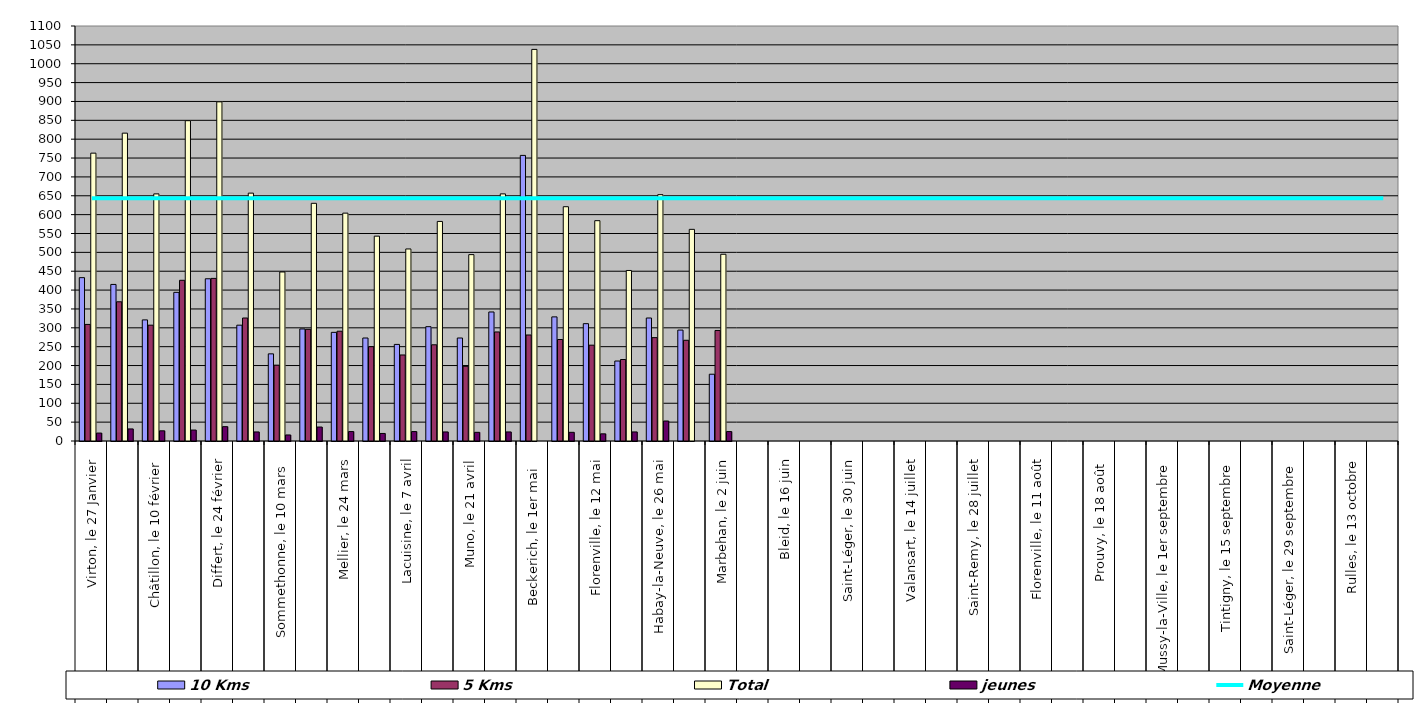
| Category | 10 Kms | 5 Kms | Total | jeunes |
|---|---|---|---|---|
| 0 | 433 | 309 | 763 | 21 |
| 1 | 415 | 369 | 816 | 32 |
| 2 | 321 | 307 | 655 | 27 |
| 3 | 394 | 426 | 849 | 29 |
| 4 | 430 | 431 | 899 | 38 |
| 5 | 307 | 326 | 657 | 24 |
| 6 | 231 | 201 | 448 | 16 |
| 7 | 297 | 296 | 630 | 37 |
| 8 | 288 | 291 | 604 | 25 |
| 9 | 273 | 250 | 543 | 20 |
| 10 | 256 | 228 | 509 | 25 |
| 11 | 303 | 255 | 582 | 24 |
| 12 | 273 | 198 | 494 | 23 |
| 13 | 342 | 289 | 655 | 24 |
| 14 | 757 | 281 | 1038 | 0 |
| 15 | 329 | 269 | 621 | 23 |
| 16 | 311 | 254 | 584 | 19 |
| 17 | 212 | 216 | 452 | 24 |
| 18 | 326 | 274 | 653 | 53 |
| 19 | 294 | 267 | 561 | 0 |
| 20 | 177 | 293 | 495 | 25 |
| 21 | 0 | 0 | 0 | 0 |
| 22 | 0 | 0 | 0 | 0 |
| 23 | 0 | 0 | 0 | 0 |
| 24 | 0 | 0 | 0 | 0 |
| 25 | 0 | 0 | 0 | 0 |
| 26 | 0 | 0 | 0 | 0 |
| 27 | 0 | 0 | 0 | 0 |
| 28 | 0 | 0 | 0 | 0 |
| 29 | 0 | 0 | 0 | 0 |
| 30 | 0 | 0 | 0 | 0 |
| 31 | 0 | 0 | 0 | 0 |
| 32 | 0 | 0 | 0 | 0 |
| 33 | 0 | 0 | 0 | 0 |
| 34 | 0 | 0 | 0 | 0 |
| 35 | 0 | 0 | 0 | 0 |
| 36 | 0 | 0 | 0 | 0 |
| 37 | 0 | 0 | 0 | 0 |
| 38 | 0 | 0 | 0 | 0 |
| 39 | 0 | 0 | 0 | 0 |
| 40 | 0 | 0 | 0 | 0 |
| 41 | 0 | 0 | 0 | 0 |